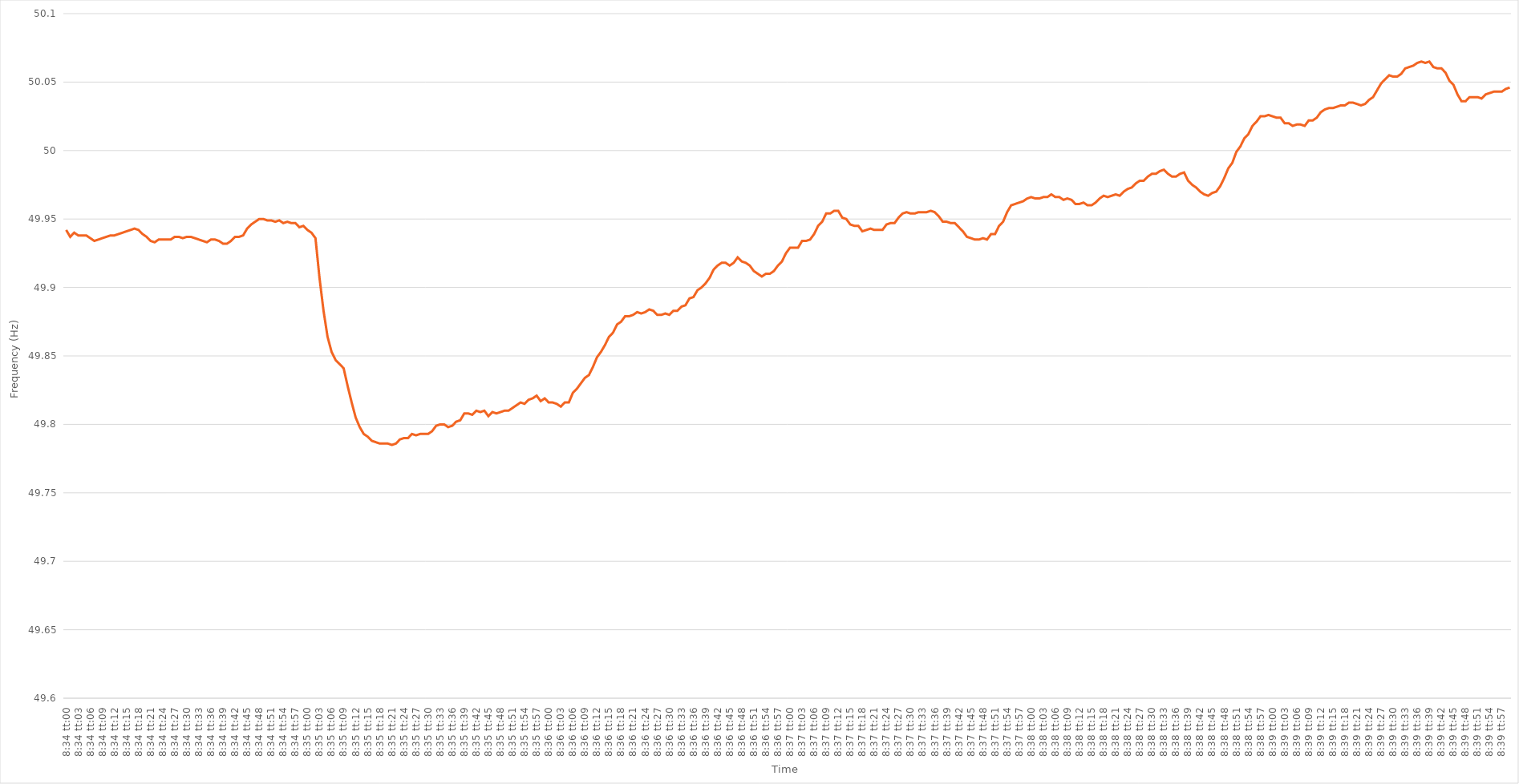
| Category | Series 0 |
|---|---|
| 0.35694444444444445 | 49.942 |
| 0.35695601851851855 | 49.937 |
| 0.3569675925925926 | 49.94 |
| 0.3569791666666667 | 49.938 |
| 0.3569907407407407 | 49.938 |
| 0.35700231481481487 | 49.938 |
| 0.3570138888888889 | 49.936 |
| 0.35702546296296295 | 49.934 |
| 0.35703703703703704 | 49.935 |
| 0.3570486111111111 | 49.936 |
| 0.3570601851851852 | 49.937 |
| 0.3570717592592592 | 49.938 |
| 0.35708333333333336 | 49.938 |
| 0.3570949074074074 | 49.939 |
| 0.3571064814814815 | 49.94 |
| 0.35711805555555554 | 49.941 |
| 0.35712962962962963 | 49.942 |
| 0.35714120370370367 | 49.943 |
| 0.3571527777777778 | 49.942 |
| 0.35716435185185186 | 49.939 |
| 0.35717592592592595 | 49.937 |
| 0.3571875 | 49.934 |
| 0.3571990740740741 | 49.933 |
| 0.3572106481481481 | 49.935 |
| 0.3572222222222223 | 49.935 |
| 0.3572337962962963 | 49.935 |
| 0.35724537037037035 | 49.935 |
| 0.35725694444444445 | 49.937 |
| 0.3572685185185185 | 49.937 |
| 0.3572800925925926 | 49.936 |
| 0.3572916666666666 | 49.937 |
| 0.35730324074074077 | 49.937 |
| 0.3573148148148148 | 49.936 |
| 0.3573263888888889 | 49.935 |
| 0.35733796296296294 | 49.934 |
| 0.35734953703703703 | 49.933 |
| 0.3573611111111111 | 49.935 |
| 0.3573726851851852 | 49.935 |
| 0.35738425925925926 | 49.934 |
| 0.35739583333333336 | 49.932 |
| 0.3574074074074074 | 49.932 |
| 0.3574189814814815 | 49.934 |
| 0.35743055555555553 | 49.937 |
| 0.3574421296296297 | 49.937 |
| 0.3574537037037037 | 49.938 |
| 0.3574652777777778 | 49.943 |
| 0.35747685185185185 | 49.946 |
| 0.3574884259259259 | 49.948 |
| 0.3575 | 49.95 |
| 0.357511574074074 | 49.95 |
| 0.3575231481481482 | 49.949 |
| 0.3575347222222222 | 49.949 |
| 0.3575462962962963 | 49.948 |
| 0.35755787037037035 | 49.949 |
| 0.35756944444444444 | 49.947 |
| 0.3575810185185185 | 49.948 |
| 0.35759259259259263 | 49.947 |
| 0.35760416666666667 | 49.947 |
| 0.35761574074074076 | 49.944 |
| 0.3576273148148148 | 49.945 |
| 0.3576388888888889 | 49.942 |
| 0.35765046296296293 | 49.94 |
| 0.3576620370370371 | 49.936 |
| 0.3576736111111111 | 49.907 |
| 0.3576851851851852 | 49.883 |
| 0.35769675925925926 | 49.864 |
| 0.35770833333333335 | 49.853 |
| 0.3577199074074074 | 49.847 |
| 0.35773148148148143 | 49.844 |
| 0.3577430555555556 | 49.841 |
| 0.3577546296296296 | 49.828 |
| 0.3577662037037037 | 49.816 |
| 0.35777777777777775 | 49.805 |
| 0.35778935185185184 | 49.798 |
| 0.3578009259259259 | 49.793 |
| 0.35781250000000003 | 49.791 |
| 0.35782407407407407 | 49.788 |
| 0.35783564814814817 | 49.787 |
| 0.3578472222222222 | 49.786 |
| 0.3578587962962963 | 49.786 |
| 0.35787037037037034 | 49.786 |
| 0.3578819444444445 | 49.785 |
| 0.3578935185185185 | 49.786 |
| 0.3579050925925926 | 49.789 |
| 0.35791666666666666 | 49.79 |
| 0.35792824074074076 | 49.79 |
| 0.3579398148148148 | 49.793 |
| 0.35795138888888894 | 49.792 |
| 0.357962962962963 | 49.793 |
| 0.357974537037037 | 49.793 |
| 0.3579861111111111 | 49.793 |
| 0.35799768518518515 | 49.795 |
| 0.35800925925925925 | 49.799 |
| 0.3580208333333333 | 49.8 |
| 0.35803240740740744 | 49.8 |
| 0.3580439814814815 | 49.798 |
| 0.35805555555555557 | 49.799 |
| 0.3580671296296296 | 49.802 |
| 0.3580787037037037 | 49.803 |
| 0.35809027777777774 | 49.808 |
| 0.3581018518518519 | 49.808 |
| 0.35811342592592593 | 49.807 |
| 0.358125 | 49.81 |
| 0.35813657407407407 | 49.809 |
| 0.35814814814814816 | 49.81 |
| 0.3581597222222222 | 49.806 |
| 0.35817129629629635 | 49.809 |
| 0.3581828703703704 | 49.808 |
| 0.3581944444444444 | 49.809 |
| 0.3582060185185185 | 49.81 |
| 0.35821759259259256 | 49.81 |
| 0.35822916666666665 | 49.812 |
| 0.3582407407407407 | 49.814 |
| 0.35825231481481484 | 49.816 |
| 0.3582638888888889 | 49.815 |
| 0.358275462962963 | 49.818 |
| 0.358287037037037 | 49.819 |
| 0.3582986111111111 | 49.821 |
| 0.35831018518518515 | 49.817 |
| 0.3583217592592593 | 49.819 |
| 0.35833333333333334 | 49.816 |
| 0.35834490740740743 | 49.816 |
| 0.35835648148148147 | 49.815 |
| 0.35836805555555556 | 49.813 |
| 0.3583796296296296 | 49.816 |
| 0.35839120370370375 | 49.816 |
| 0.3584027777777778 | 49.823 |
| 0.3584143518518519 | 49.826 |
| 0.3584259259259259 | 49.83 |
| 0.35843749999999996 | 49.834 |
| 0.35844907407407406 | 49.836 |
| 0.3584606481481481 | 49.842 |
| 0.35847222222222225 | 49.849 |
| 0.3584837962962963 | 49.853 |
| 0.3584953703703704 | 49.858 |
| 0.3585069444444444 | 49.864 |
| 0.3585185185185185 | 49.867 |
| 0.35853009259259255 | 49.873 |
| 0.3585416666666667 | 49.875 |
| 0.35855324074074074 | 49.879 |
| 0.35856481481481484 | 49.879 |
| 0.3585763888888889 | 49.88 |
| 0.35858796296296297 | 49.882 |
| 0.358599537037037 | 49.881 |
| 0.35861111111111116 | 49.882 |
| 0.3586226851851852 | 49.884 |
| 0.3586342592592593 | 49.883 |
| 0.35864583333333333 | 49.88 |
| 0.3586574074074074 | 49.88 |
| 0.35866898148148146 | 49.881 |
| 0.3586805555555555 | 49.88 |
| 0.35869212962962965 | 49.883 |
| 0.3587037037037037 | 49.883 |
| 0.3587152777777778 | 49.886 |
| 0.3587268518518518 | 49.887 |
| 0.3587384259259259 | 49.892 |
| 0.35874999999999996 | 49.893 |
| 0.3587615740740741 | 49.898 |
| 0.35877314814814815 | 49.9 |
| 0.35878472222222224 | 49.903 |
| 0.3587962962962963 | 49.907 |
| 0.3588078703703704 | 49.913 |
| 0.3588194444444444 | 49.916 |
| 0.35883101851851856 | 49.918 |
| 0.3588425925925926 | 49.918 |
| 0.3588541666666667 | 49.916 |
| 0.35886574074074074 | 49.918 |
| 0.35887731481481483 | 49.922 |
| 0.35888888888888887 | 49.919 |
| 0.358900462962963 | 49.918 |
| 0.35891203703703706 | 49.916 |
| 0.3589236111111111 | 49.912 |
| 0.3589351851851852 | 49.91 |
| 0.35894675925925923 | 49.908 |
| 0.3589583333333333 | 49.91 |
| 0.35896990740740736 | 49.91 |
| 0.3589814814814815 | 49.912 |
| 0.35899305555555555 | 49.916 |
| 0.35900462962962965 | 49.919 |
| 0.3590162037037037 | 49.925 |
| 0.3590277777777778 | 49.929 |
| 0.3590393518518518 | 49.929 |
| 0.35905092592592597 | 49.929 |
| 0.3590625 | 49.934 |
| 0.3590740740740741 | 49.934 |
| 0.35908564814814814 | 49.935 |
| 0.35909722222222223 | 49.939 |
| 0.3591087962962963 | 49.945 |
| 0.3591203703703704 | 49.948 |
| 0.35913194444444446 | 49.954 |
| 0.3591435185185185 | 49.954 |
| 0.3591550925925926 | 49.956 |
| 0.35916666666666663 | 49.956 |
| 0.35917824074074073 | 49.951 |
| 0.35918981481481477 | 49.95 |
| 0.3592013888888889 | 49.946 |
| 0.35921296296296296 | 49.945 |
| 0.35922453703703705 | 49.945 |
| 0.3592361111111111 | 49.941 |
| 0.3592476851851852 | 49.942 |
| 0.3592592592592592 | 49.943 |
| 0.3592708333333334 | 49.942 |
| 0.3592824074074074 | 49.942 |
| 0.3592939814814815 | 49.942 |
| 0.35930555555555554 | 49.946 |
| 0.35931712962962964 | 49.947 |
| 0.3593287037037037 | 49.947 |
| 0.35934027777777783 | 49.951 |
| 0.35935185185185187 | 49.954 |
| 0.35936342592592596 | 49.955 |
| 0.359375 | 49.954 |
| 0.35938657407407404 | 49.954 |
| 0.35939814814814813 | 49.955 |
| 0.35940972222222217 | 49.955 |
| 0.3594212962962963 | 49.955 |
| 0.35943287037037036 | 49.956 |
| 0.35944444444444446 | 49.955 |
| 0.3594560185185185 | 49.952 |
| 0.3594675925925926 | 49.948 |
| 0.3594791666666666 | 49.948 |
| 0.3594907407407408 | 49.947 |
| 0.3595023148148148 | 49.947 |
| 0.3595138888888889 | 49.944 |
| 0.35952546296296295 | 49.941 |
| 0.35953703703703704 | 49.937 |
| 0.3595486111111111 | 49.936 |
| 0.35956018518518523 | 49.935 |
| 0.35957175925925927 | 49.935 |
| 0.35958333333333337 | 49.936 |
| 0.3595949074074074 | 49.935 |
| 0.3596064814814815 | 49.939 |
| 0.35961805555555554 | 49.939 |
| 0.3596296296296296 | 49.945 |
| 0.3596412037037037 | 49.948 |
| 0.35965277777777777 | 49.955 |
| 0.35966435185185186 | 49.96 |
| 0.3596759259259259 | 49.961 |
| 0.3596875 | 49.962 |
| 0.35969907407407403 | 49.963 |
| 0.3597106481481482 | 49.965 |
| 0.3597222222222222 | 49.966 |
| 0.3597337962962963 | 49.965 |
| 0.35974537037037035 | 49.965 |
| 0.35975694444444445 | 49.966 |
| 0.3597685185185185 | 49.966 |
| 0.35978009259259264 | 49.968 |
| 0.3597916666666667 | 49.966 |
| 0.35980324074074077 | 49.966 |
| 0.3598148148148148 | 49.964 |
| 0.3598263888888889 | 49.965 |
| 0.35983796296296294 | 49.964 |
| 0.359849537037037 | 49.961 |
| 0.35986111111111113 | 49.961 |
| 0.35987268518518517 | 49.962 |
| 0.35988425925925926 | 49.96 |
| 0.3598958333333333 | 49.96 |
| 0.3599074074074074 | 49.962 |
| 0.35991898148148144 | 49.965 |
| 0.3599305555555556 | 49.967 |
| 0.3599421296296296 | 49.966 |
| 0.3599537037037037 | 49.967 |
| 0.35996527777777776 | 49.968 |
| 0.35997685185185185 | 49.967 |
| 0.3599884259259259 | 49.97 |
| 0.36000000000000004 | 49.972 |
| 0.3600115740740741 | 49.973 |
| 0.3600231481481482 | 49.976 |
| 0.3600347222222222 | 49.978 |
| 0.3600462962962963 | 49.978 |
| 0.36005787037037035 | 49.981 |
| 0.3600694444444445 | 49.983 |
| 0.36008101851851854 | 49.983 |
| 0.3600925925925926 | 49.985 |
| 0.36010416666666667 | 49.986 |
| 0.3601157407407407 | 49.983 |
| 0.3601273148148148 | 49.981 |
| 0.36013888888888884 | 49.981 |
| 0.360150462962963 | 49.983 |
| 0.36016203703703703 | 49.984 |
| 0.3601736111111111 | 49.978 |
| 0.36018518518518516 | 49.975 |
| 0.36019675925925926 | 49.973 |
| 0.3602083333333333 | 49.97 |
| 0.36021990740740745 | 49.968 |
| 0.3602314814814815 | 49.967 |
| 0.3602430555555556 | 49.969 |
| 0.3602546296296296 | 49.97 |
| 0.3602662037037037 | 49.974 |
| 0.36027777777777775 | 49.98 |
| 0.3602893518518519 | 49.987 |
| 0.36030092592592594 | 49.991 |
| 0.36031250000000004 | 49.999 |
| 0.3603240740740741 | 50.003 |
| 0.3603356481481481 | 50.009 |
| 0.3603472222222222 | 50.012 |
| 0.36035879629629625 | 50.018 |
| 0.3603703703703704 | 50.021 |
| 0.36038194444444444 | 50.025 |
| 0.36039351851851853 | 50.025 |
| 0.36040509259259257 | 50.026 |
| 0.36041666666666666 | 50.025 |
| 0.3604282407407407 | 50.024 |
| 0.36043981481481485 | 50.024 |
| 0.3604513888888889 | 50.02 |
| 0.360462962962963 | 50.02 |
| 0.360474537037037 | 50.018 |
| 0.3604861111111111 | 50.019 |
| 0.36049768518518516 | 50.019 |
| 0.3605092592592593 | 50.018 |
| 0.36052083333333335 | 50.022 |
| 0.36053240740740744 | 50.022 |
| 0.3605439814814815 | 50.024 |
| 0.3605555555555556 | 50.028 |
| 0.3605671296296296 | 50.03 |
| 0.36057870370370365 | 50.031 |
| 0.3605902777777778 | 50.031 |
| 0.36060185185185184 | 50.032 |
| 0.36061342592592593 | 50.033 |
| 0.360625 | 50.033 |
| 0.36063657407407407 | 50.035 |
| 0.3606481481481481 | 50.035 |
| 0.36065972222222226 | 50.034 |
| 0.3606712962962963 | 50.033 |
| 0.3606828703703704 | 50.034 |
| 0.36069444444444443 | 50.037 |
| 0.3607060185185185 | 50.039 |
| 0.36071759259259256 | 50.044 |
| 0.3607291666666667 | 50.049 |
| 0.36074074074074075 | 50.052 |
| 0.36075231481481485 | 50.055 |
| 0.3607638888888889 | 50.054 |
| 0.360775462962963 | 50.054 |
| 0.360787037037037 | 50.056 |
| 0.36079861111111106 | 50.06 |
| 0.3608101851851852 | 50.061 |
| 0.36082175925925924 | 50.062 |
| 0.36083333333333334 | 50.064 |
| 0.3608449074074074 | 50.065 |
| 0.3608564814814815 | 50.064 |
| 0.3608680555555555 | 50.065 |
| 0.36087962962962966 | 50.061 |
| 0.3608912037037037 | 50.06 |
| 0.3609027777777778 | 50.06 |
| 0.36091435185185183 | 50.057 |
| 0.36092592592592593 | 50.051 |
| 0.36093749999999997 | 50.048 |
| 0.3609490740740741 | 50.041 |
| 0.36096064814814816 | 50.036 |
| 0.36097222222222225 | 50.036 |
| 0.3609837962962963 | 50.039 |
| 0.3609953703703704 | 50.039 |
| 0.3610069444444444 | 50.039 |
| 0.36101851851851857 | 50.038 |
| 0.3610300925925926 | 50.041 |
| 0.36104166666666665 | 50.042 |
| 0.36105324074074074 | 50.043 |
| 0.3610648148148148 | 50.043 |
| 0.3610763888888889 | 50.043 |
| 0.3610879629629629 | 50.045 |
| 0.36109953703703707 | 50.046 |